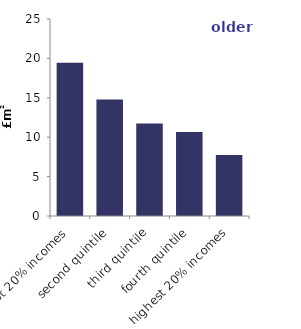
| Category | older households |
|---|---|
| lowest 20% incomes | 19.44 |
| second quintile | 14.788 |
| third quintile | 11.739 |
| fourth quintile | 10.674 |
| highest 20% incomes | 7.736 |